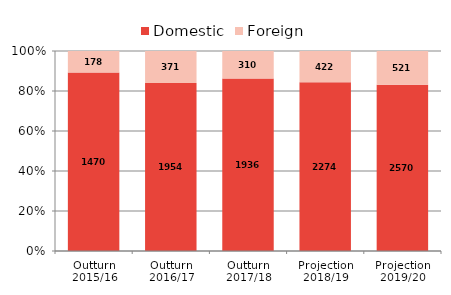
| Category | Domestic | Foreign |
|---|---|---|
| Outturn 2015/16 | 1470 | 178 |
| Outturn 2016/17 | 1954 | 371 |
| Outturn 2017/18 | 1936 | 310 |
| Projection 2018/19 | 2274 | 422 |
| Projection 2019/20 | 2570 | 521 |